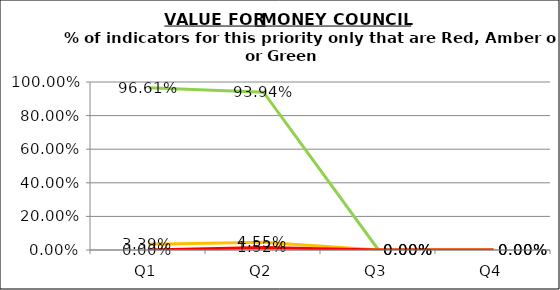
| Category | Green | Amber | Red |
|---|---|---|---|
| Q1 | 0.966 | 0.034 | 0 |
| Q2 | 0.939 | 0.045 | 0.015 |
| Q3 | 0 | 0 | 0 |
| Q4 | 0 | 0 | 0 |